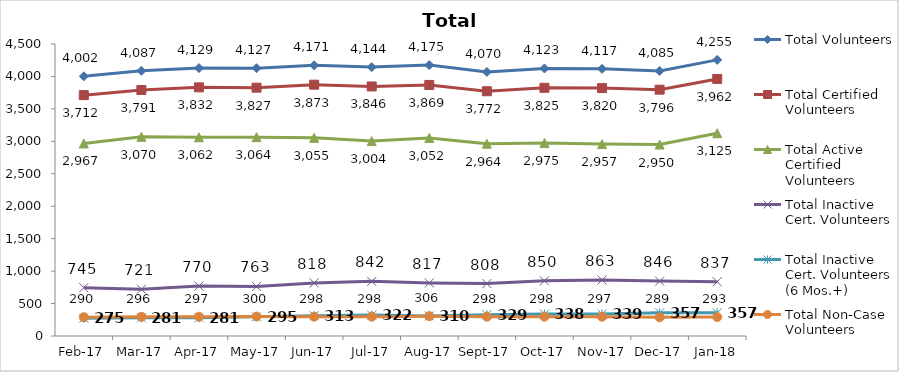
| Category | Total Volunteers | Total Certified Volunteers | Total Active Certified Volunteers | Total Inactive Cert. Volunteers | Total Inactive Cert. Volunteers (6 Mos.+) | Total Non-Case Volunteers |
|---|---|---|---|---|---|---|
| 2017-02-01 | 4002 | 3712 | 2967 | 745 | 275 | 290 |
| 2017-03-01 | 4087 | 3791 | 3070 | 721 | 281 | 296 |
| 2017-04-01 | 4129 | 3832 | 3062 | 770 | 281 | 297 |
| 2017-05-01 | 4127 | 3827 | 3064 | 763 | 295 | 300 |
| 2017-06-01 | 4171 | 3873 | 3055 | 818 | 313 | 298 |
| 2017-07-01 | 4144 | 3846 | 3004 | 842 | 322 | 298 |
| 2017-08-01 | 4175 | 3869 | 3052 | 817 | 310 | 306 |
| 2017-09-01 | 4070 | 3772 | 2964 | 808 | 329 | 298 |
| 2017-10-01 | 4123 | 3825 | 2975 | 850 | 338 | 298 |
| 2017-11-01 | 4117 | 3820 | 2957 | 863 | 339 | 297 |
| 2017-12-01 | 4085 | 3796 | 2950 | 846 | 357 | 289 |
| 2018-01-01 | 4255 | 3962 | 3125 | 837 | 357 | 293 |